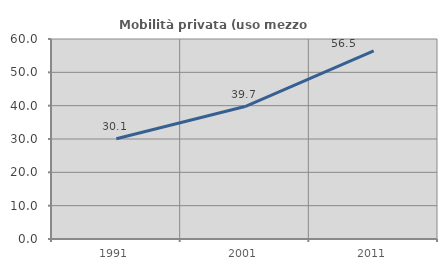
| Category | Mobilità privata (uso mezzo privato) |
|---|---|
| 1991.0 | 30.053 |
| 2001.0 | 39.744 |
| 2011.0 | 56.47 |